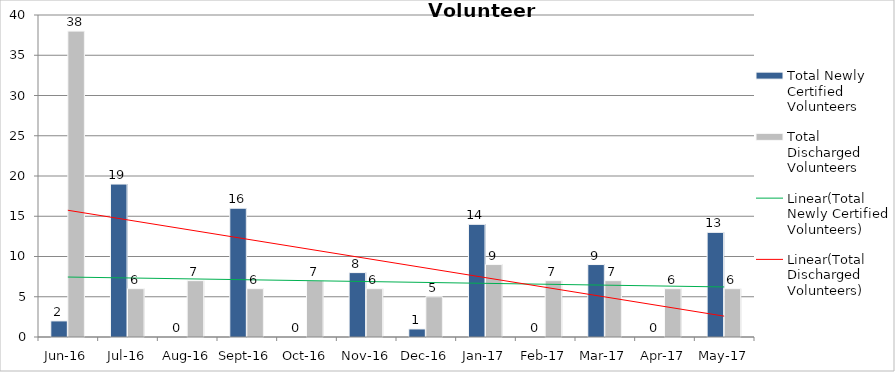
| Category | Total Newly Certified Volunteers | Total Discharged Volunteers |
|---|---|---|
| Jun-16 | 2 | 38 |
| Jul-16 | 19 | 6 |
| Aug-16 | 0 | 7 |
| Sep-16 | 16 | 6 |
| Oct-16 | 0 | 7 |
| Nov-16 | 8 | 6 |
| Dec-16 | 1 | 5 |
| Jan-17 | 14 | 9 |
| Feb-17 | 0 | 7 |
| Mar-17 | 9 | 7 |
| Apr-17 | 0 | 6 |
| May-17 | 13 | 6 |